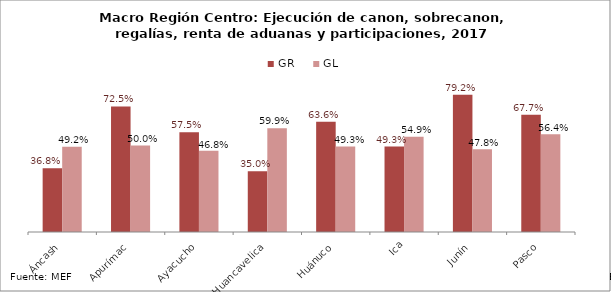
| Category | GR | GL |
|---|---|---|
| Áncash | 0.368 | 0.492 |
| Apurímac | 0.725 | 0.5 |
| Ayacucho | 0.575 | 0.468 |
| Huancavelica | 0.35 | 0.599 |
| Huánuco | 0.636 | 0.493 |
| Ica | 0.493 | 0.549 |
| Junín | 0.792 | 0.478 |
| Pasco | 0.677 | 0.564 |